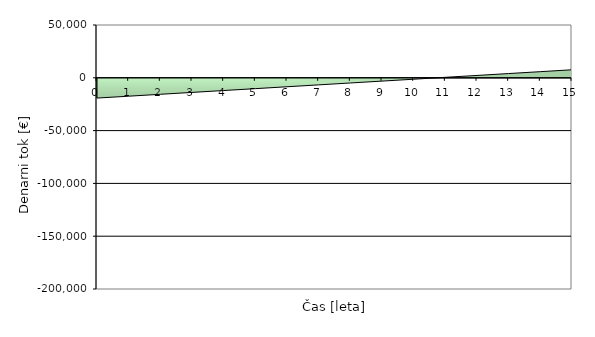
| Category | Series 0 |
|---|---|
| 0.0 | -19200 |
| 1.0 | -17413.648 |
| 2.0 | -15627.297 |
| 3.0 | -13840.945 |
| 4.0 | -12054.593 |
| 5.0 | -10268.241 |
| 6.0 | -8481.89 |
| 7.0 | -6695.538 |
| 8.0 | -4909.186 |
| 9.0 | -3122.834 |
| 10.0 | -1336.483 |
| 11.0 | 449.869 |
| 12.0 | 2236.221 |
| 13.0 | 4022.573 |
| 14.0 | 5808.924 |
| 15.0 | 7595.276 |